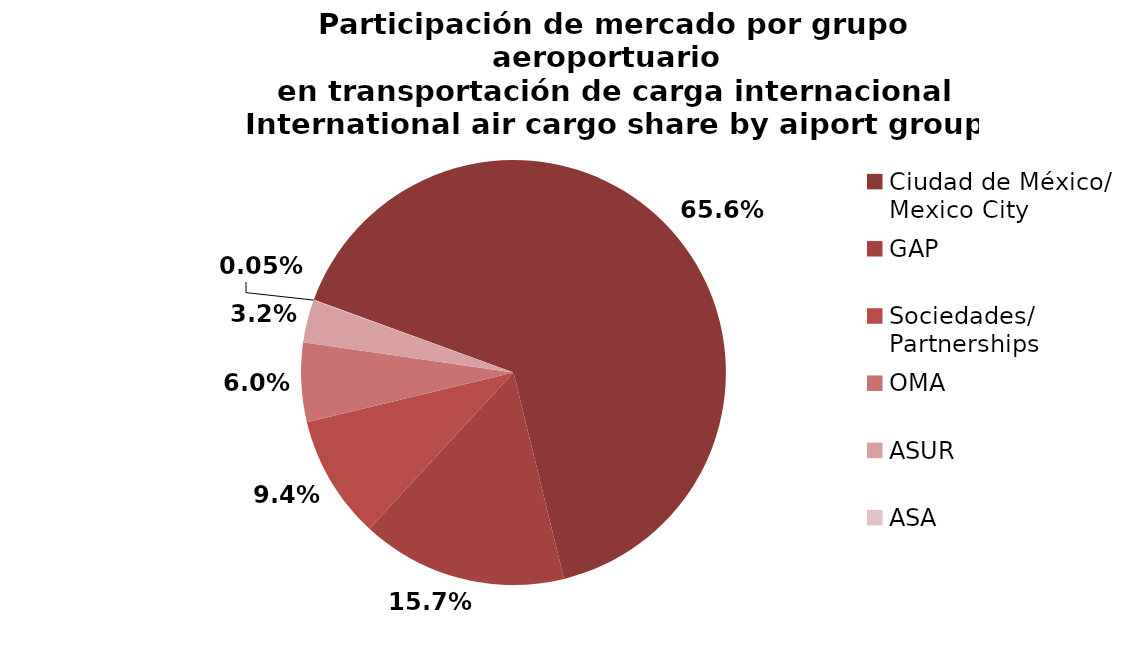
| Category | Series 0 |
|---|---|
| Ciudad de México/
Mexico City | 39634.35 |
| GAP | 9472.196 |
| Sociedades/
Partnerships | 5668.828 |
| OMA | 3636.449 |
| ASUR | 1959.607 |
| ASA | 26.6 |